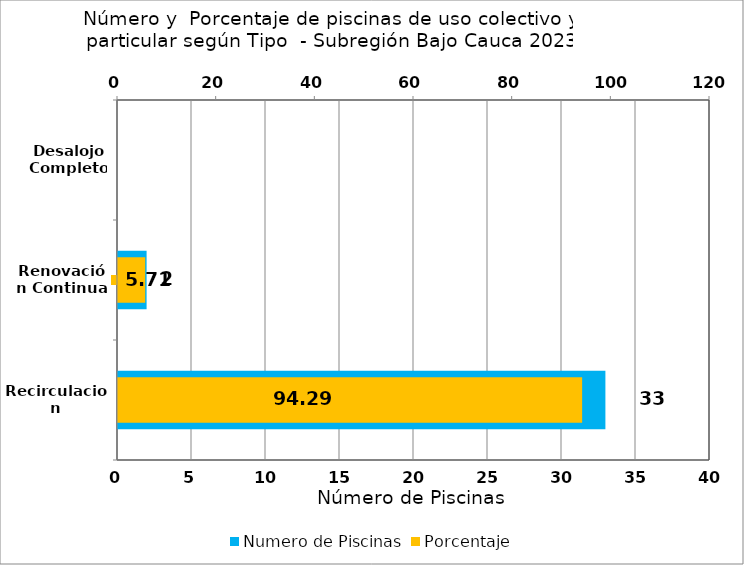
| Category | Numero de Piscinas |
|---|---|
| Recirculacion | 33 |
| Renovación Continua | 2 |
| Desalojo Completo | 0 |